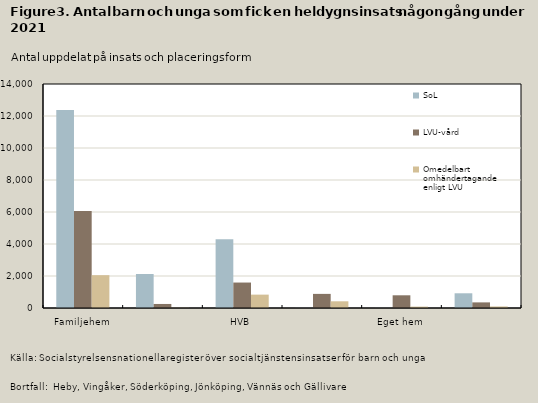
| Category | SoL | LVU-vård | Omedelbart 
omhändertagande 
enligt LVU |
|---|---|---|---|
| Familjehem | 12376 | 6065 | 2052 |
| Stödboende | 2125 | 252 | 18 |
| HVB | 4294 | 1591 | 836 |
| Särskilt ungdomshem enligt 12 § LVU | 8 | 882 | 419 |
| Eget hem | 7 | 794 | 86 |
| Annan placeringsform        | 920 | 351 | 96 |